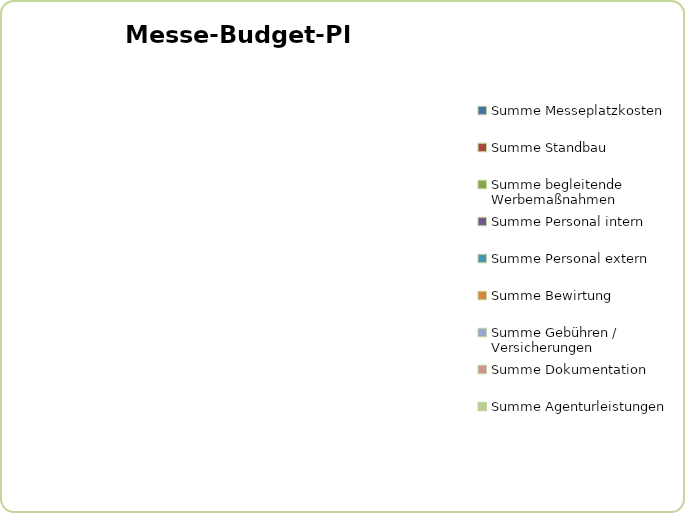
| Category | Series 0 |
|---|---|
| Summe Messeplatzkosten | 0 |
| Summe Standbau | 0 |
| Summe begleitende Werbemaßnahmen  | 0 |
| Summe Personal intern | 0 |
| Summe Personal extern | 0 |
| Summe Bewirtung  | 0 |
| Summe Gebühren / Versicherungen | 0 |
| Summe Dokumentation  | 0 |
| Summe Agenturleistungen | 0 |